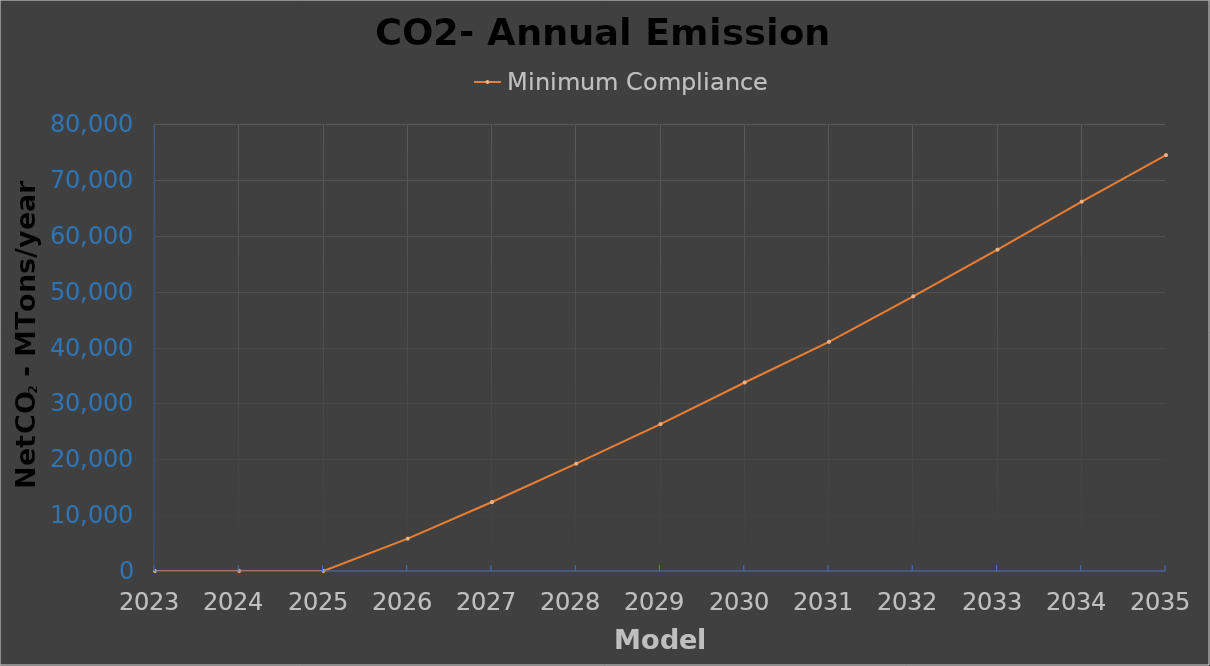
| Category | Minimum Compliance |
|---|---|
| 2023.0 | 0 |
| 2024.0 | 0 |
| 2025.0 | 0 |
| 2026.0 | 5797.132 |
| 2027.0 | 12342.461 |
| 2028.0 | 19213.622 |
| 2029.0 | 26282.855 |
| 2030.0 | 33738.786 |
| 2031.0 | 41013.217 |
| 2032.0 | 49160.992 |
| 2033.0 | 57514.323 |
| 2034.0 | 66106.994 |
| 2035.0 | 74432.822 |